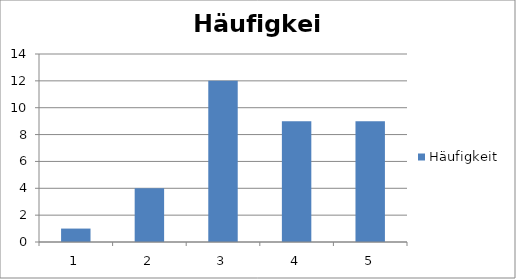
| Category | Häufigkeit |
|---|---|
| 1.0 | 1 |
| 2.0 | 4 |
| 3.0 | 12 |
| 4.0 | 9 |
| 5.0 | 9 |